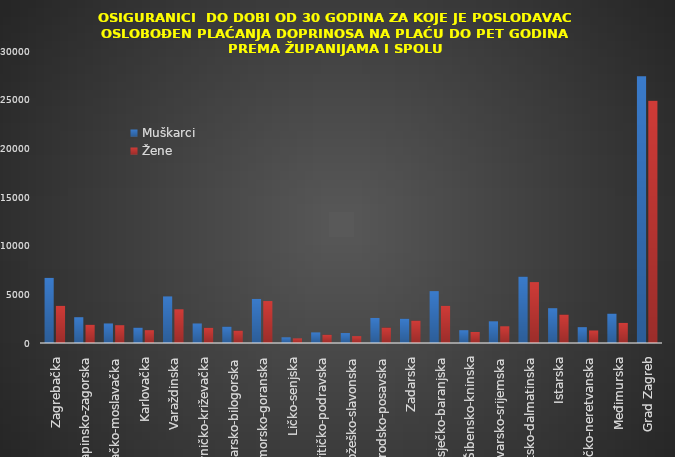
| Category | Muškarci | Žene |
|---|---|---|
| Zagrebačka | 6691 | 3817 |
| Krapinsko-zagorska | 2649 | 1872 |
| Sisačko-moslavačka | 2007 | 1827 |
| Karlovačka | 1580 | 1317 |
| Varaždinska | 4785 | 3464 |
| Koprivničko-križevačka | 2005 | 1565 |
| Bjelovarsko-bilogorska | 1682 | 1275 |
| Primorsko-goranska | 4530 | 4309 |
| Ličko-senjska | 585 | 474 |
| Virovitičko-podravska | 1088 | 851 |
| Požeško-slavonska | 1022 | 705 |
| Brodsko-posavska | 2574 | 1592 |
| Zadarska | 2495 | 2300 |
| Osječko-baranjska | 5329 | 3815 |
| Šibensko-kninska | 1315 | 1133 |
| Vukovarsko-srijemska | 2227 | 1716 |
| Splitsko-dalmatinska | 6819 | 6255 |
| Istarska | 3574 | 2921 |
| Dubrovačko-neretvanska | 1626 | 1286 |
| Međimurska | 3019 | 2064 |
| Grad Zagreb | 27407 | 24885 |